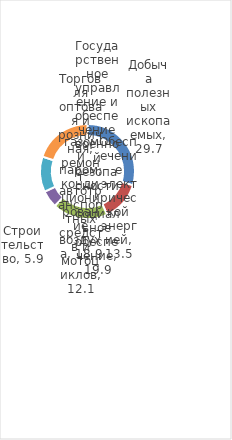
| Category | Итог |
|---|---|
| Добыча полезных ископаемых | 29.7 |
| Обеспечение электрической энергией, газом и паром; кондиционирование воздуха | 13.5 |
| Строительство | 18.9 |
| Торговля оптовая и розничная; ремонт автотранспортных средств и мотоциклов | 5.9 |
| Государственное управление и обеспечение военной безопасности; социальное обеспечение | 12.1 |
| Другие виды деятельности | 19.9 |